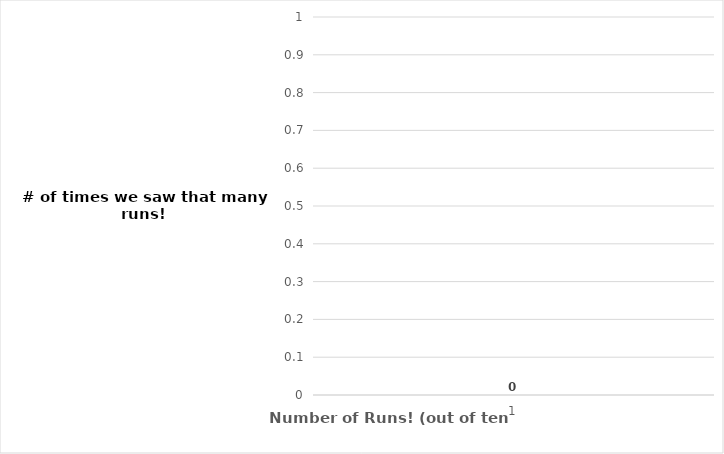
| Category | Cumulative Frequency |
|---|---|
| 1.0 | 0 |
| 2.0 | 0 |
| 3.0 | 0 |
| 4.0 | 1 |
| 5.0 | 3 |
| 6.0 | 0 |
| 7.0 | 0 |
| 8.0 | 0 |
| 9.0 | 0 |
| 10.0 | 0 |